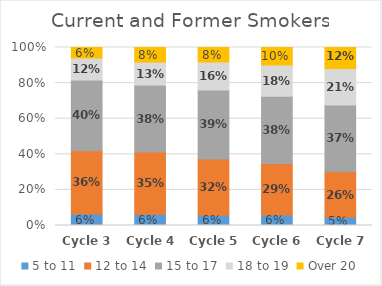
| Category | 5 to 11 | 12 to 14 | 15 to 17 | 18 to 19 | Over 20 |
|---|---|---|---|---|---|
| Cycle 3 | 0.065 | 0.356 | 0.397 | 0.124 | 0.059 |
| Cycle 4 | 0.064 | 0.349 | 0.376 | 0.129 | 0.082 |
| Cycle 5 | 0.058 | 0.316 | 0.387 | 0.158 | 0.081 |
| Cycle 6 | 0.059 | 0.289 | 0.378 | 0.176 | 0.098 |
| Cycle 7 | 0.046 | 0.256 | 0.375 | 0.206 | 0.117 |